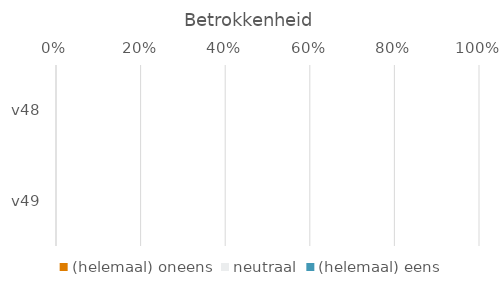
| Category | (helemaal) oneens | neutraal | (helemaal) eens |
|---|---|---|---|
| v48 | 0 | 0 | 0 |
| v49 | 0 | 0 | 0 |